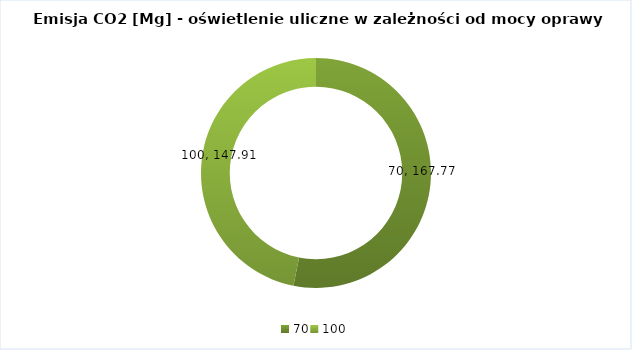
| Category | Emisja CO2 [Mg CO2] |
|---|---|
| 70.0 | 167.765 |
| 100.0 | 147.91 |